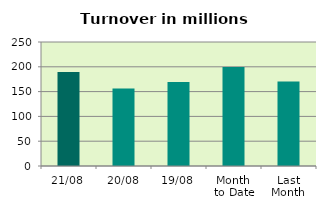
| Category | Series 0 |
|---|---|
| 21/08 | 189.646 |
| 20/08 | 156.131 |
| 19/08 | 169.184 |
| Month 
to Date | 199.617 |
| Last
Month | 170.387 |